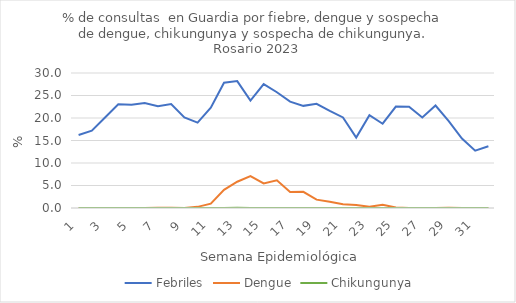
| Category | Febriles | Dengue | Chikungunya |
|---|---|---|---|
| 0 | 16.226 | 0 | 0 |
| 1 | 17.185 | 0 | 0 |
| 2 | 20.119 | 0 | 0 |
| 3 | 23.072 | 0 | 0 |
| 4 | 22.942 | 0 | 0 |
| 5 | 23.308 | 0 | 0 |
| 6 | 22.625 | 0.036 | 0 |
| 7 | 23.117 | 0.037 | 0 |
| 8 | 20.109 | 0 | 0 |
| 9 | 18.984 | 0.252 | 0 |
| 10 | 22.281 | 0.962 | 0 |
| 11 | 27.852 | 4.03 | 0 |
| 12 | 28.202 | 5.838 | 0.029 |
| 13 | 23.854 | 7.071 | 0 |
| 14 | 27.538 | 5.459 | 0 |
| 15 | 25.731 | 6.14 | 0 |
| 16 | 23.631 | 3.557 | 0 |
| 17 | 22.698 | 3.592 | 0 |
| 18 | 23.144 | 1.863 | 0 |
| 19 | 21.576 | 1.407 | 0 |
| 20 | 20.122 | 0.814 | 0 |
| 21 | 15.65 | 0.678 | 0 |
| 22 | 20.62 | 0.264 | 0 |
| 23 | 18.726 | 0.704 | 0 |
| 24 | 22.534 | 0.114 | 0 |
| 25 | 22.518 | 0 | 0 |
| 26 | 20.127 | 0 | 0 |
| 27 | 22.776 | 0 | 0 |
| 28 | 19.32 | 0.039 | 0 |
| 29 | 15.423 | 0 | 0 |
| 30 | 12.746 | 0 | 0 |
| 31 | 13.708 | 0 | 0 |